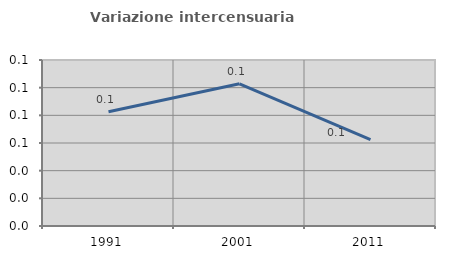
| Category | Variazione intercensuaria annua |
|---|---|
| 1991.0 | 0.083 |
| 2001.0 | 0.103 |
| 2011.0 | 0.062 |